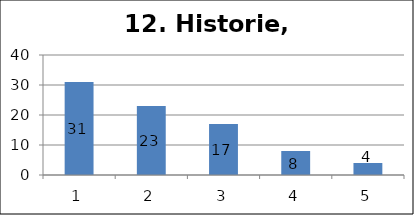
| Category | Series 1 |
|---|---|
| 0 | 31 |
| 1 | 23 |
| 2 | 17 |
| 3 | 8 |
| 4 | 4 |